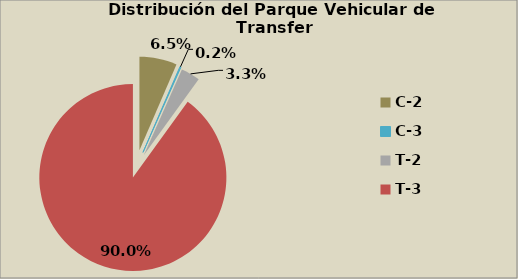
| Category | Series 0 |
|---|---|
| C-2 | 6.476 |
| C-3  | 0.19 |
| T-2 | 3.296 |
| T-3 | 90.039 |